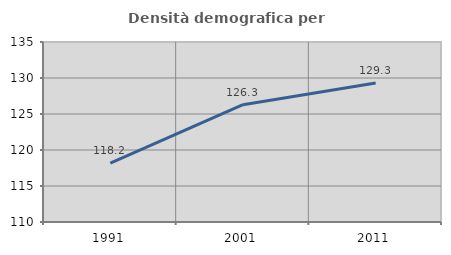
| Category | Densità demografica |
|---|---|
| 1991.0 | 118.173 |
| 2001.0 | 126.288 |
| 2011.0 | 129.311 |